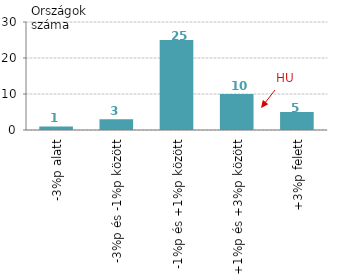
| Category | Országok száma |
|---|---|
| -3%p alatt | 1 |
| -3%p és -1%p között | 3 |
| -1%p és +1%p között | 25 |
| +1%p és +3%p között | 10 |
| +3%p felett | 5 |